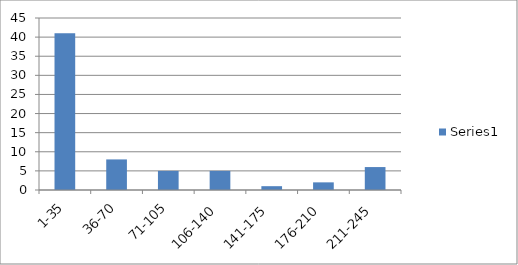
| Category | Series 0 |
|---|---|
| 1-35 | 41 |
| 36-70 | 8 |
| 71-105 | 5 |
| 106-140 | 5 |
| 141-175 | 1 |
| 176-210 | 2 |
| 211-245 | 6 |